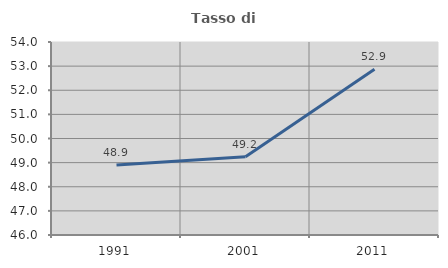
| Category | Tasso di occupazione   |
|---|---|
| 1991.0 | 48.904 |
| 2001.0 | 49.243 |
| 2011.0 | 52.868 |